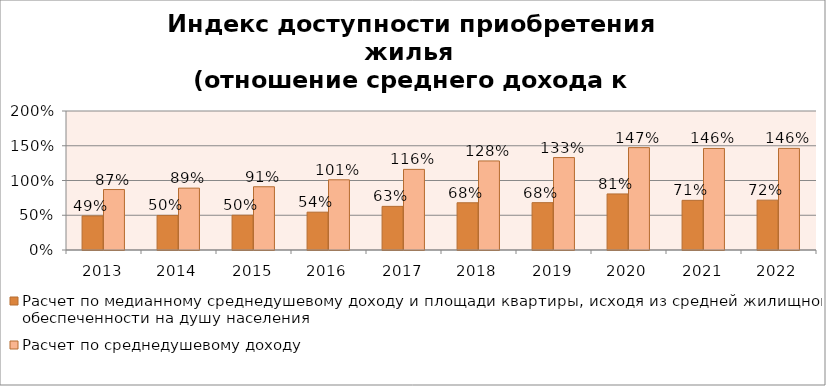
| Category | Расчет по медианному среднедушевому доходу и площади квартиры, исходя из средней жилищной обеспеченности на душу населения | Расчет по среднедушевому доходу |
|---|---|---|
| 2013 | 0.49 | 0.87 |
| 2014 | 0.497 | 0.89 |
| 2015 | 0.5 | 0.91 |
| 2016 | 0.545 | 1.01 |
| 2017 | 0.628 | 1.16 |
| 2018 | 0.68 | 1.281 |
| 2019 | 0.681 | 1.33 |
| 2020 | 0.807 | 1.473 |
| 2021 | 0.715 | 1.461 |
| 2022 | 0.717 | 1.462 |